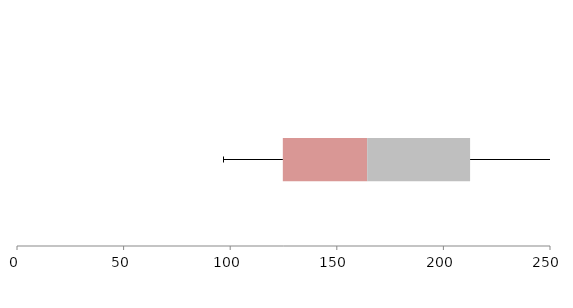
| Category | Series 1 | Series 2 | Series 3 |
|---|---|---|---|
| 0 | 124.683 | 39.565 | 48.272 |